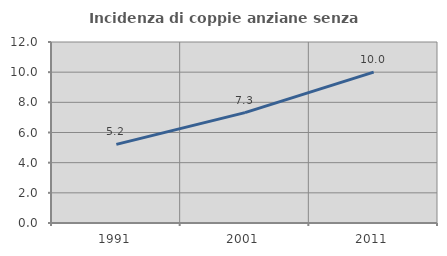
| Category | Incidenza di coppie anziane senza figli  |
|---|---|
| 1991.0 | 5.21 |
| 2001.0 | 7.315 |
| 2011.0 | 10 |